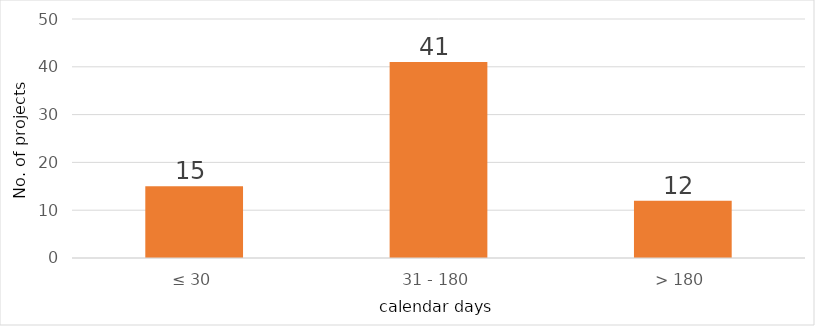
| Category | Series 0 |
|---|---|
| 0 | 15 |
| 1 | 41 |
| 2 | 12 |